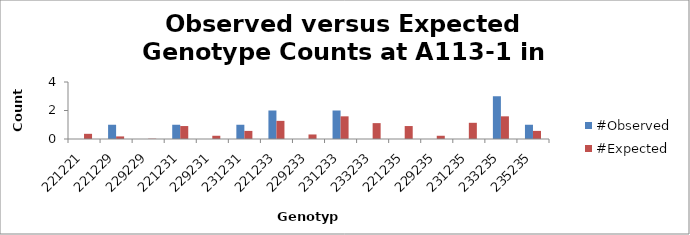
| Category | #Observed | #Expected |
|---|---|---|
| 221221.0 | 0 | 0.364 |
| 221229.0 | 1 | 0.182 |
| 229229.0 | 0 | 0.023 |
| 221231.0 | 1 | 0.909 |
| 229231.0 | 0 | 0.227 |
| 231231.0 | 1 | 0.568 |
| 221233.0 | 2 | 1.273 |
| 229233.0 | 0 | 0.318 |
| 231233.0 | 2 | 1.591 |
| 233233.0 | 0 | 1.114 |
| 221235.0 | 0 | 0.909 |
| 229235.0 | 0 | 0.227 |
| 231235.0 | 0 | 1.136 |
| 233235.0 | 3 | 1.591 |
| 235235.0 | 1 | 0.568 |